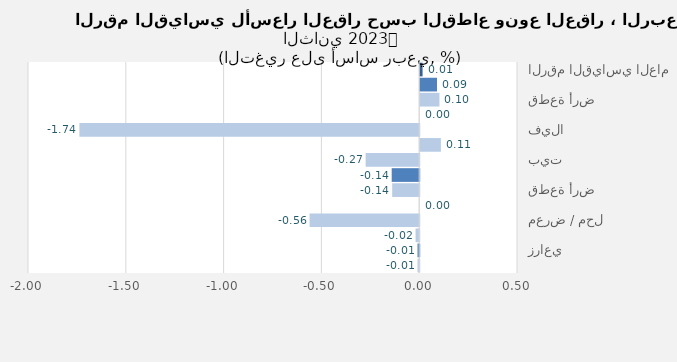
| Category | Series 0 |
|---|---|
| الرقم القياسي العام | 0.012 |
| سكني | 0.086 |
| قطعة أرض | 0.098 |
| عمارة | 0 |
| فيلا | -1.737 |
| شقة | 0.106 |
| بيت | -0.274 |
| تجاري | -0.141 |
| قطعة أرض | -0.138 |
| عمارة | 0 |
| معرض / محل | -0.56 |
| مركز تجاري | -0.019 |
| زراعي | -0.009 |
| أرض زراعية | -0.009 |